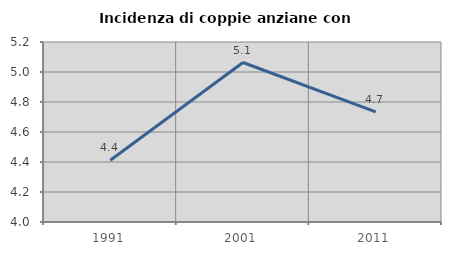
| Category | Incidenza di coppie anziane con figli |
|---|---|
| 1991.0 | 4.412 |
| 2001.0 | 5.063 |
| 2011.0 | 4.734 |